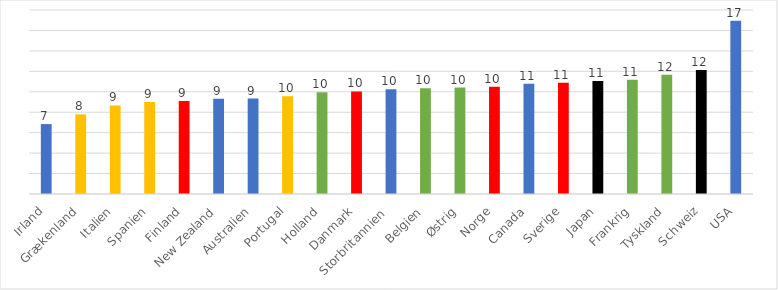
| Category | Series 0 |
|---|---|
| Irland | 6.841 |
| Grækenland | 7.791 |
| Italien | 8.661 |
| Spanien | 8.999 |
| Finland | 9.086 |
| New Zealand | 9.319 |
| Australien | 9.334 |
| Portugal | 9.563 |
| Holland | 9.965 |
| Danmark | 10.031 |
| Storbritannien  | 10.254 |
| Belgien | 10.349 |
| Østrig | 10.408 |
| Norge | 10.489 |
| Canada | 10.79 |
| Sverige | 10.882 |
| Japan | 11.055 |
| Frankrig | 11.186 |
| Tyskland | 11.654 |
| Schweiz | 12.142 |
| USA | 16.96 |